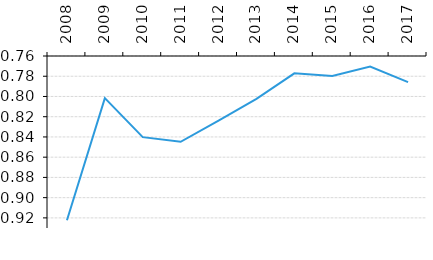
| Category | NEER (V3) |
|---|---|
| 2008.0 | 0.922 |
| 2009.0 | 0.802 |
| 2010.0 | 0.84 |
| 2011.0 | 0.845 |
| 2012.0 | 0.824 |
| 2013.0 | 0.802 |
| 2014.0 | 0.777 |
| 2015.0 | 0.78 |
| 2016.0 | 0.77 |
| 2017.0 | 0.786 |